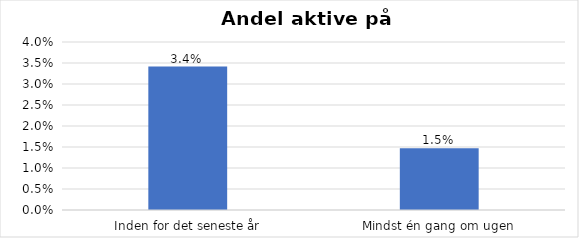
| Category | % |
|---|---|
| Inden for det seneste år | 0.034 |
| Mindst én gang om ugen | 0.015 |